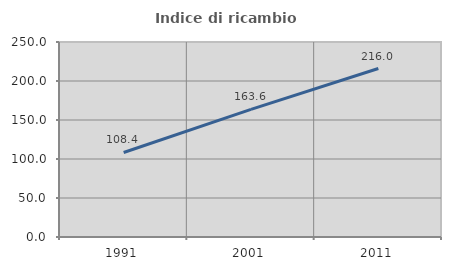
| Category | Indice di ricambio occupazionale  |
|---|---|
| 1991.0 | 108.387 |
| 2001.0 | 163.636 |
| 2011.0 | 216 |